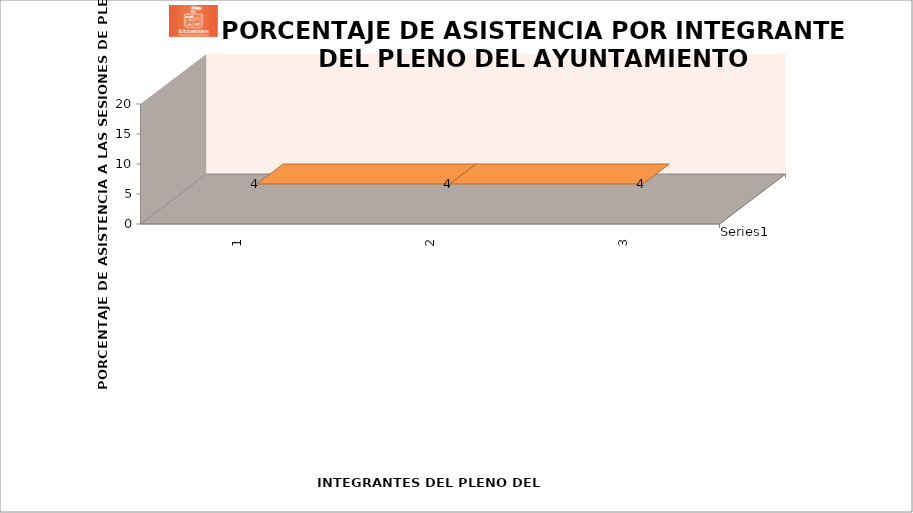
| Category | Series 0 |
|---|---|
| 0 | 4 |
| 1 | 4 |
| 2 | 4 |